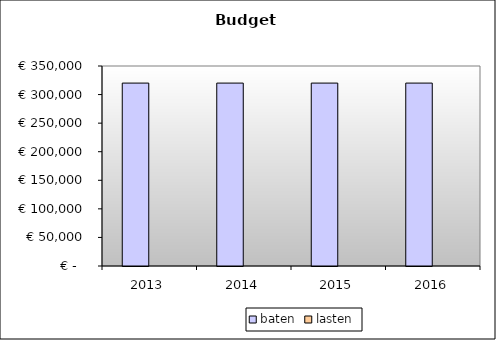
| Category | baten | lasten |
|---|---|---|
| 2013.0 | 320104.82 | 0 |
| 2014.0 | 320104.82 | 0 |
| 2015.0 | 320104.82 | 0 |
| 2016.0 | 320104.82 | 0 |